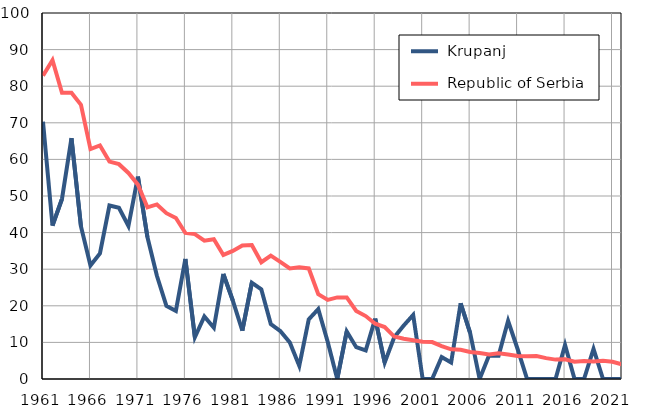
| Category |  Krupanj |  Republic of Serbia |
|---|---|---|
| 1961.0 | 70.3 | 82.9 |
| 1962.0 | 41.9 | 87.1 |
| 1963.0 | 49.2 | 78.2 |
| 1964.0 | 65.8 | 78.2 |
| 1965.0 | 41.7 | 74.9 |
| 1966.0 | 31 | 62.8 |
| 1967.0 | 34.3 | 63.8 |
| 1968.0 | 47.4 | 59.4 |
| 1969.0 | 46.8 | 58.7 |
| 1970.0 | 41.8 | 56.3 |
| 1971.0 | 55.3 | 53.1 |
| 1972.0 | 38.8 | 46.9 |
| 1973.0 | 28.2 | 47.7 |
| 1974.0 | 20 | 45.3 |
| 1975.0 | 18.6 | 44 |
| 1976.0 | 32.8 | 39.9 |
| 1977.0 | 11.4 | 39.6 |
| 1978.0 | 17.1 | 37.8 |
| 1979.0 | 14 | 38.2 |
| 1980.0 | 28.7 | 33.9 |
| 1981.0 | 21.4 | 35 |
| 1982.0 | 13.2 | 36.5 |
| 1983.0 | 26.3 | 36.6 |
| 1984.0 | 24.5 | 31.9 |
| 1985.0 | 15 | 33.7 |
| 1986.0 | 13.1 | 32 |
| 1987.0 | 10 | 30.2 |
| 1988.0 | 3.6 | 30.5 |
| 1989.0 | 16.3 | 30.2 |
| 1990.0 | 19.1 | 23.2 |
| 1991.0 | 10.1 | 21.6 |
| 1992.0 | 0 | 22.3 |
| 1993.0 | 13 | 22.3 |
| 1994.0 | 8.7 | 18.6 |
| 1995.0 | 7.8 | 17.2 |
| 1996.0 | 16.5 | 15.1 |
| 1997.0 | 4.5 | 14.2 |
| 1998.0 | 11.4 | 11.6 |
| 1999.0 | 14.6 | 11 |
| 2000.0 | 17.5 | 10.6 |
| 2001.0 | 0 | 10.2 |
| 2002.0 | 0 | 10.1 |
| 2003.0 | 6 | 9 |
| 2004.0 | 4.5 | 8.1 |
| 2005.0 | 20.7 | 8 |
| 2006.0 | 12.6 | 7.4 |
| 2007.0 | 0 | 7.1 |
| 2008.0 | 6.5 | 6.7 |
| 2009.0 | 6.4 | 7 |
| 2010.0 | 15.9 | 6.7 |
| 2011.0 | 8.2 | 6.3 |
| 2012.0 | 0 | 6.2 |
| 2013.0 | 0 | 6.3 |
| 2014.0 | 0 | 5.7 |
| 2015.0 | 0 | 5.3 |
| 2016.0 | 9.3 | 5.4 |
| 2017.0 | 0 | 4.7 |
| 2018.0 | 0 | 4.9 |
| 2019.0 | 8.2 | 4.8 |
| 2020.0 | 0 | 5 |
| 2021.0 | 0 | 4.7 |
| 2022.0 | 0 | 4 |